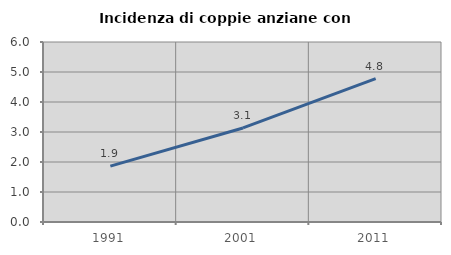
| Category | Incidenza di coppie anziane con figli |
|---|---|
| 1991.0 | 1.862 |
| 2001.0 | 3.135 |
| 2011.0 | 4.777 |